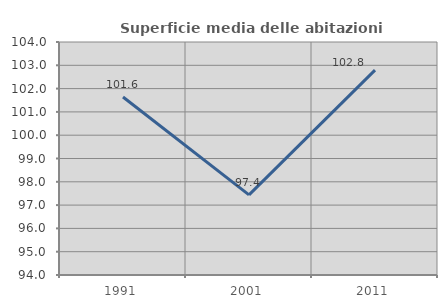
| Category | Superficie media delle abitazioni occupate |
|---|---|
| 1991.0 | 101.638 |
| 2001.0 | 97.441 |
| 2011.0 | 102.792 |